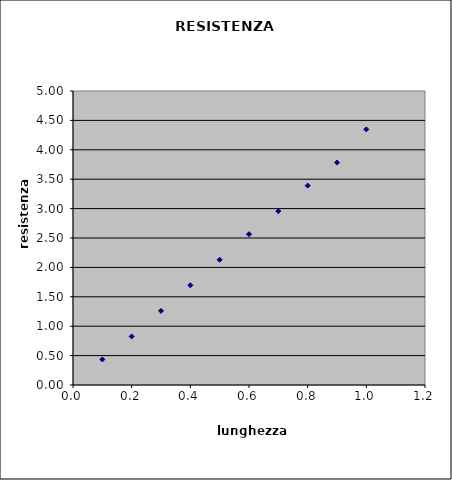
| Category | corrente (ampere) |
|---|---|
| 1.0 | 4.348 |
| 0.9 | 3.783 |
| 0.8 | 3.391 |
| 0.7 | 2.957 |
| 0.6 | 2.565 |
| 0.5 | 2.13 |
| 0.4 | 1.696 |
| 0.3 | 1.261 |
| 0.2 | 0.826 |
| 0.1 | 0.435 |